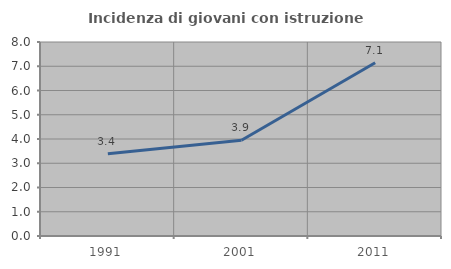
| Category | Incidenza di giovani con istruzione universitaria |
|---|---|
| 1991.0 | 3.39 |
| 2001.0 | 3.947 |
| 2011.0 | 7.143 |